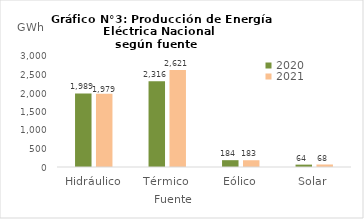
| Category | 2020 | 2021 |
|---|---|---|
| Hidráulico | 1989.378 | 1979.272 |
| Térmico | 2315.684 | 2621.267 |
| Eólico | 184.272 | 182.616 |
| Solar | 64.289 | 67.536 |